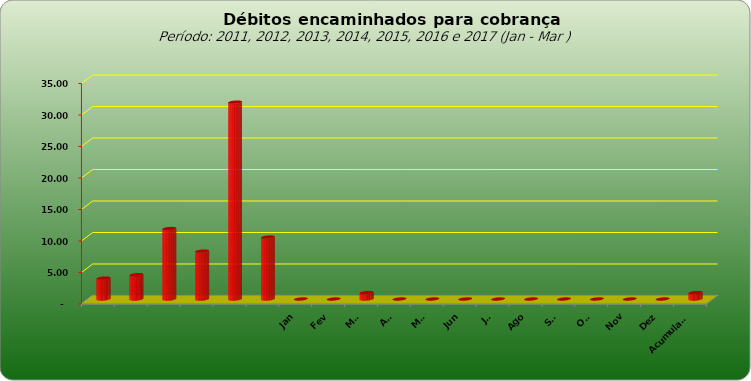
| Category |  3.309.443,02  |
|---|---|
|  | 3309443.02 |
|  | 3859728.44 |
|  | 11181928.25 |
|  | 7600526.01 |
|  | 31248623.5 |
|  | 9830198.34 |
| Jan | 0 |
| Fev | 0 |
| Mar | 1019401.01 |
| Abr | 0 |
| Mai | 0 |
| Jun | 0 |
| Jul | 0 |
| Ago | 0 |
| Set | 0 |
| Out | 0 |
| Nov | 0 |
| Dez | 0 |
| Acumulado | 1019401.01 |